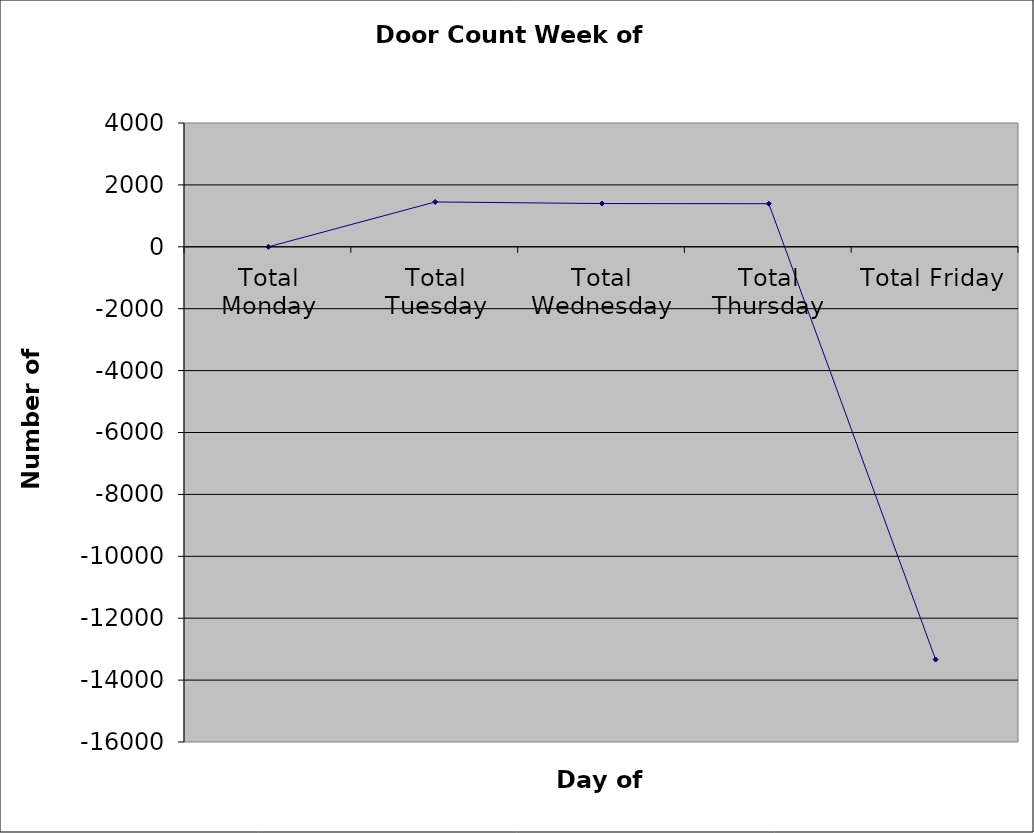
| Category | Series 0 |
|---|---|
| Total Monday | 0 |
| Total Tuesday | 1449 |
| Total Wednesday | 1397.5 |
| Total Thursday | 1392 |
| Total Friday | -13335 |